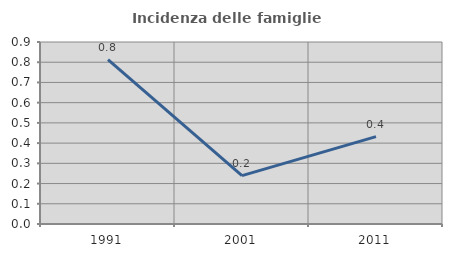
| Category | Incidenza delle famiglie numerose |
|---|---|
| 1991.0 | 0.813 |
| 2001.0 | 0.239 |
| 2011.0 | 0.432 |